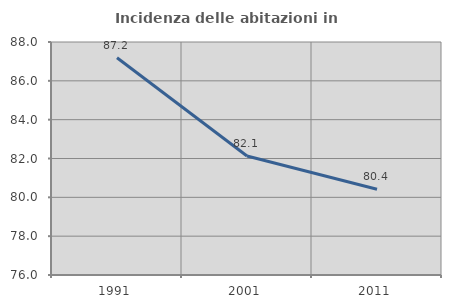
| Category | Incidenza delle abitazioni in proprietà  |
|---|---|
| 1991.0 | 87.192 |
| 2001.0 | 82.129 |
| 2011.0 | 80.412 |